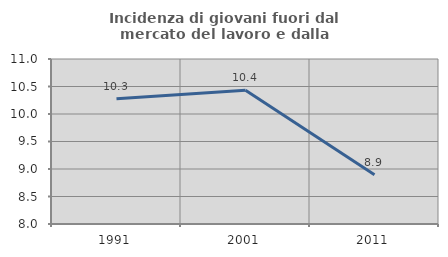
| Category | Incidenza di giovani fuori dal mercato del lavoro e dalla formazione  |
|---|---|
| 1991.0 | 10.276 |
| 2001.0 | 10.432 |
| 2011.0 | 8.897 |